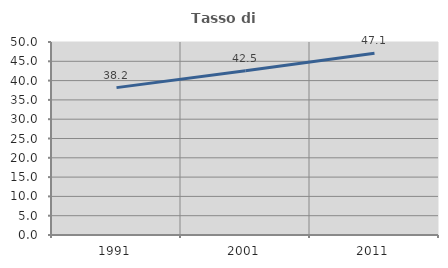
| Category | Tasso di occupazione   |
|---|---|
| 1991.0 | 38.177 |
| 2001.0 | 42.541 |
| 2011.0 | 47.082 |